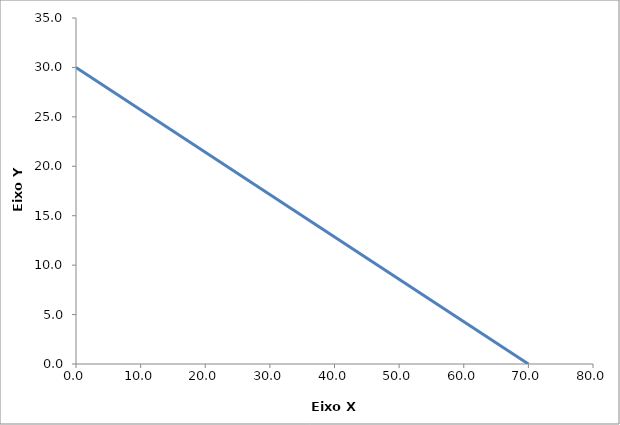
| Category | Series 0 |
|---|---|
| 0.0 | 30 |
| 70.0 | 0 |